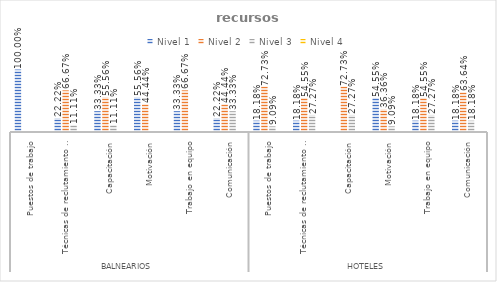
| Category | Nivel 1 | Nivel 2 | Nivel 3 | Nivel 4 |
|---|---|---|---|---|
| 0 | 1 | 0 | 0 | 0 |
| 1 | 0.222 | 0.667 | 0.111 | 0 |
| 2 | 0.333 | 0.556 | 0.111 | 0 |
| 3 | 0.556 | 0.444 | 0 | 0 |
| 4 | 0.333 | 0.667 | 0 | 0 |
| 5 | 0.222 | 0.444 | 0.333 | 0 |
| 6 | 0.182 | 0.727 | 0.091 | 0 |
| 7 | 0.182 | 0.545 | 0.273 | 0 |
| 8 | 0 | 0.727 | 0.273 | 0 |
| 9 | 0.545 | 0.364 | 0.091 | 0 |
| 10 | 0.182 | 0.545 | 0.273 | 0 |
| 11 | 0.182 | 0.636 | 0.182 | 0 |